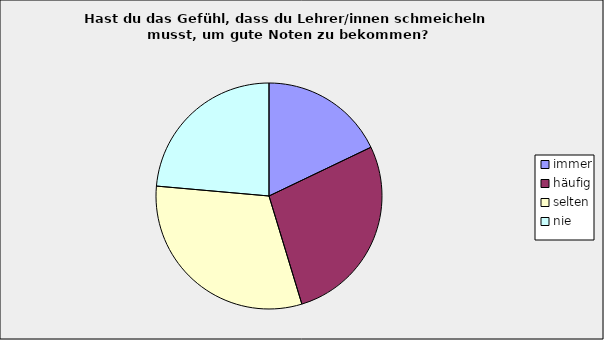
| Category | Series 0 |
|---|---|
| immer | 0.179 |
| häufig | 0.274 |
| selten | 0.311 |
| nie | 0.236 |